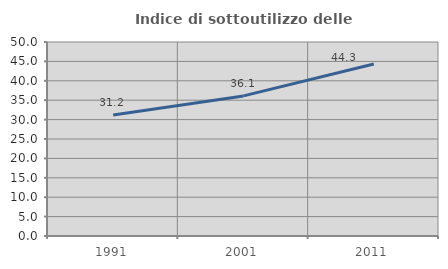
| Category | Indice di sottoutilizzo delle abitazioni  |
|---|---|
| 1991.0 | 31.176 |
| 2001.0 | 36.105 |
| 2011.0 | 44.328 |